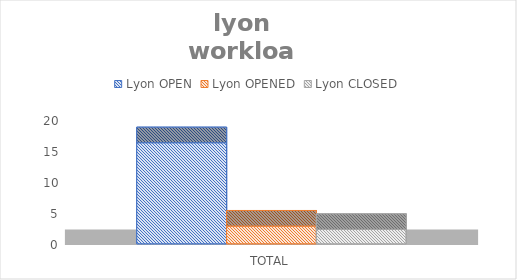
| Category | Lyon |
|---|---|
| TOTAL | 2.316 |